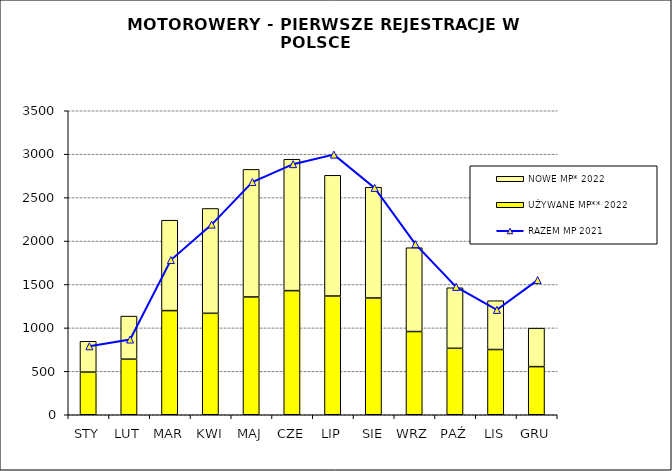
| Category | UŻYWANE MP** 2022 | NOWE MP* 2022 |
|---|---|---|
| STY | 491 | 355 |
| LUT | 640 | 496 |
| MAR | 1199 | 1041 |
| KWI | 1168 | 1207 |
| MAJ | 1356 | 1469 |
| CZE | 1429 | 1513 |
| LIP | 1367 | 1390 |
| SIE | 1344 | 1276 |
| WRZ | 958 | 965 |
| PAŹ | 765 | 697 |
| LIS | 751 | 562 |
| GRU | 554 | 443 |